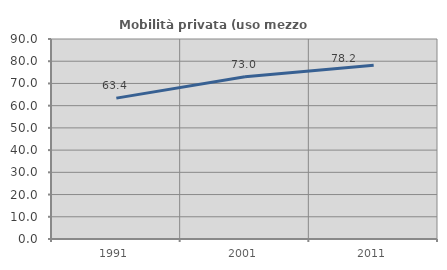
| Category | Mobilità privata (uso mezzo privato) |
|---|---|
| 1991.0 | 63.401 |
| 2001.0 | 72.998 |
| 2011.0 | 78.204 |